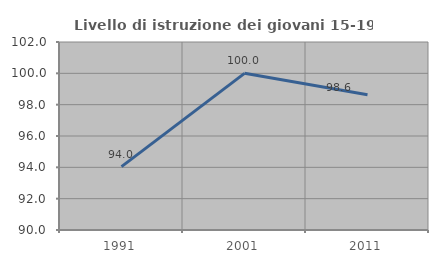
| Category | Livello di istruzione dei giovani 15-19 anni |
|---|---|
| 1991.0 | 94.048 |
| 2001.0 | 100 |
| 2011.0 | 98.63 |